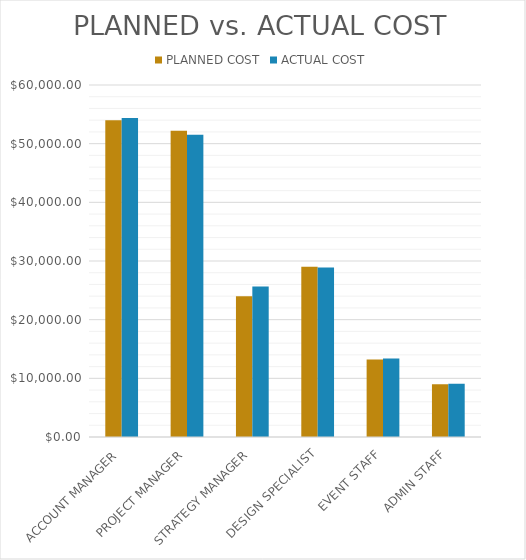
| Category | PLANNED COST | ACTUAL COST |
|---|---|---|
| ACCOUNT MANAGER | 54000 | 54360 |
| PROJECT MANAGER | 52200 | 51540 |
| STRATEGY MANAGER | 24000 | 25650 |
| DESIGN SPECIALIST | 29000 | 28900 |
| EVENT STAFF | 13200 | 13400 |
| ADMIN STAFF | 9000 | 9060 |